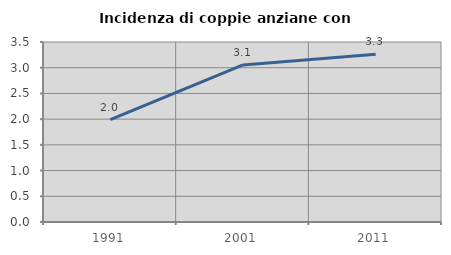
| Category | Incidenza di coppie anziane con figli |
|---|---|
| 1991.0 | 1.992 |
| 2001.0 | 3.054 |
| 2011.0 | 3.26 |